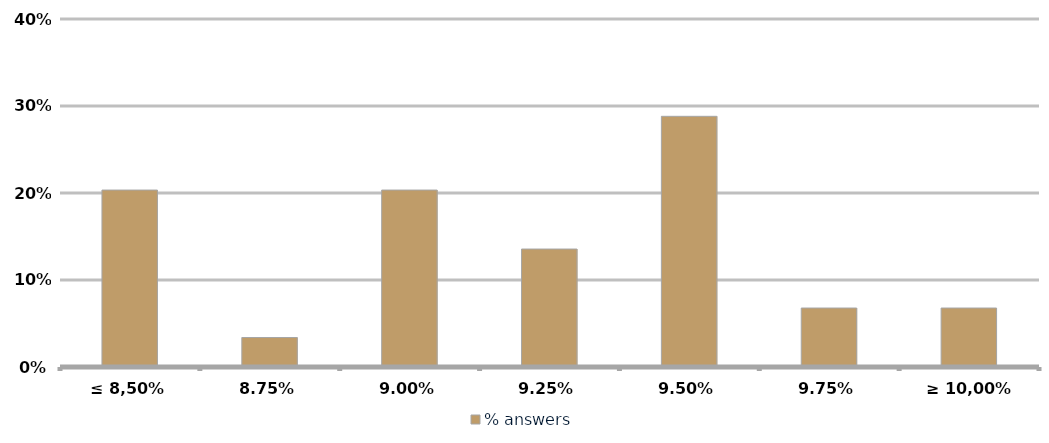
| Category | % answers |
|---|---|
| ≤ 8,50% | 0.203 |
| 8.75% | 0.034 |
| 9.00% | 0.203 |
| 9.25% | 0.136 |
| 9.50% | 0.288 |
| 9.75% | 0.068 |
| ≥ 10,00% | 0.068 |